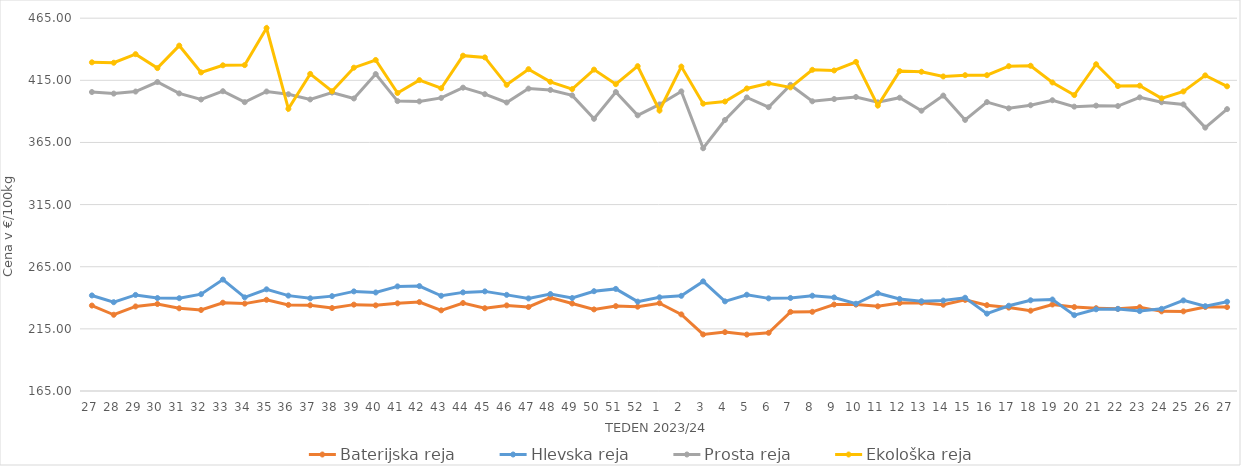
| Category | Baterijska reja | Hlevska reja | Prosta reja | Ekološka reja |
|---|---|---|---|---|
| 27.0 | 233.75 | 241.89 | 405.58 | 429.48 |
| 28.0 | 226.35 | 236.46 | 404.32 | 429.14 |
| 29.0 | 233.03 | 242.31 | 405.96 | 436.04 |
| 30.0 | 235 | 239.8 | 413.63 | 424.83 |
| 31.0 | 231.55 | 239.67 | 404.46 | 442.93 |
| 32.0 | 230.2 | 242.89 | 399.57 | 421.38 |
| 33.0 | 236.04 | 254.68 | 406.23 | 427.07 |
| 34.0 | 235.32 | 240.35 | 397.45 | 427.24 |
| 35.0 | 238.39 | 246.82 | 406 | 457.07 |
| 36.0 | 234.27 | 241.75 | 403.79 | 392.07 |
| 37.0 | 234 | 239.58 | 399.61 | 420.17 |
| 38.0 | 231.74 | 241.34 | 405.14 | 406.21 |
| 39.0 | 234.5 | 245.15 | 400.39 | 425.17 |
| 40.0 | 233.92 | 244.29 | 420.04 | 431.38 |
| 41.0 | 235.54 | 249.18 | 398.28 | 404.83 |
| 42.0 | 236.54 | 249.42 | 398.03 | 415.17 |
| 43.0 | 229.92 | 241.62 | 400.86 | 408.62 |
| 44.0 | 235.77 | 244.36 | 409.1 | 434.83 |
| 45.0 | 231.6 | 245.16 | 403.86 | 433.45 |
| 46.0 | 233.89 | 242.36 | 397.17 | 411.38 |
| 47.0 | 232.62 | 239.48 | 408.34 | 423.97 |
| 48.0 | 240.11 | 243.04 | 407.25 | 413.79 |
| 49.0 | 235.41 | 239.81 | 402.87 | 407.93 |
| 50.0 | 230.65 | 245.3 | 384.02 | 423.62 |
| 51.0 | 233.3 | 247.16 | 405.6 | 411.9 |
| 52.0 | 232.85 | 236.91 | 386.82 | 426.38 |
| 1.0 | 235.66 | 240.38 | 395.59 | 390.69 |
| 2.0 | 226.65 | 241.59 | 406.11 | 426.03 |
| 3.0 | 210.5 | 253.21 | 360.35 | 396.21 |
| 4.0 | 212.37 | 237.14 | 383.09 | 397.93 |
| 5.0 | 210.38 | 242.47 | 401.23 | 408.45 |
| 6.0 | 211.82 | 239.54 | 393.39 | 412.59 |
| 7.0 | 228.66 | 239.86 | 411.29 | 409.31 |
| 8.0 | 228.73 | 241.68 | 398.12 | 423.45 |
| 9.0 | 234.57 | 240.29 | 399.93 | 422.93 |
| 10.0 | 234.52 | 235.22 | 401.58 | 429.83 |
| 11.0 | 233.13 | 243.7 | 397.29 | 394.66 |
| 12.0 | 235.73 | 239.09 | 401.01 | 422.41 |
| 13.0 | 236.07 | 237.25 | 390.54 | 421.9 |
| 14.0 | 234.43 | 237.78 | 402.72 | 418.1 |
| 15.0 | 238.3 | 240.04 | 383.13 | 419.14 |
| 16.0 | 234.08 | 227.24 | 397.47 | 419.14 |
| 17.0 | 232.11 | 233.6 | 392.45 | 426.38 |
| 18.0 | 229.63 | 237.99 | 394.95 | 426.72 |
| 19.0 | 234.63 | 238.62 | 398.97 | 413.28 |
| 20.0 | 232.54 | 226.01 | 393.82 | 403.1 |
| 21.0 | 231.64 | 230.74 | 394.63 | 427.93 |
| 22.0 | 231.11 | 231.05 | 394.3 | 410.35 |
| 23.0 | 232.45 | 229.29 | 401.26 | 410.69 |
| 24.0 | 229.09 | 231.11 | 397.37 | 400.52 |
| 25.0 | 229.07 | 237.89 | 395.59 | 406.03 |
| 26.0 | 232.61 | 233.24 | 376.92 | 418.97 |
| 27.0 | 232.53 | 236.82 | 391.82 | 410.17 |